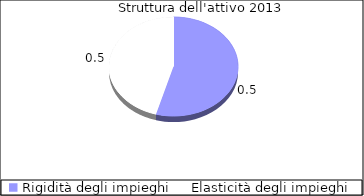
| Category | Series1 |
|---|---|
| Rigidità degli impieghi | 0.544 |
| Elasticità degli impieghi | 0.456 |